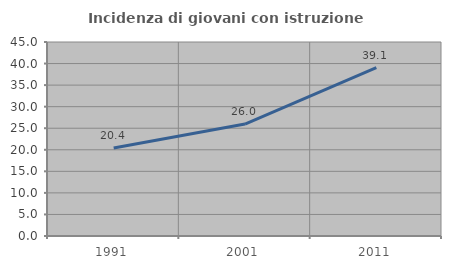
| Category | Incidenza di giovani con istruzione universitaria |
|---|---|
| 1991.0 | 20.395 |
| 2001.0 | 25.96 |
| 2011.0 | 39.079 |